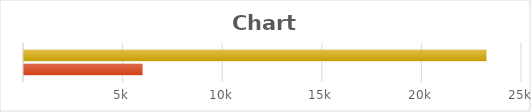
| Category | TOTAL LIABILITIES | TOTAL ASSETS |
|---|---|---|
| 0 | 5952 | 23216 |